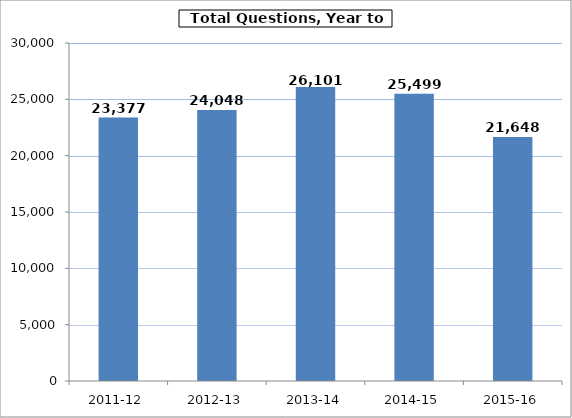
| Category | Series 0 |
|---|---|
| 2011-12 | 23377 |
| 2012-13 | 24048 |
| 2013-14 | 26101 |
| 2014-15 | 25499 |
| 2015-16 | 21648 |